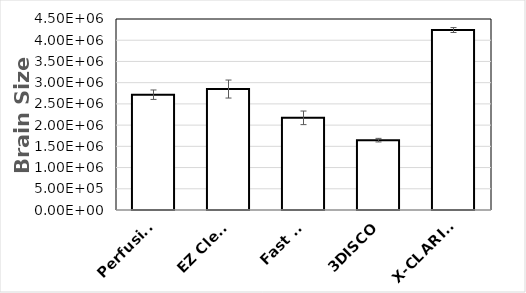
| Category | Series 0 |
|---|---|
| Perfusion | 2716631.062 |
| EZ Clear | 2849877.75 |
| Fast 3D | 2171721.25 |
| 3DISCO | 1645414.25 |
| X-CLARITY | 4240192 |